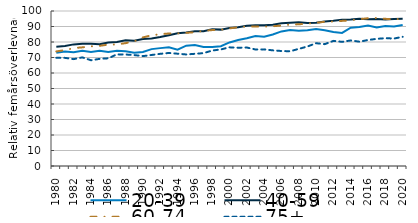
| Category | 20-39 | 40-59 | 60-74 | 75+ |
|---|---|---|---|---|
| 1980 | 73.013 | 76.924 | 73.924 | 69.779 |
| 1981 | 73.892 | 77.371 | 74.763 | 69.762 |
| 1982 | 73.431 | 78.462 | 76.093 | 68.935 |
| 1983 | 74.323 | 78.809 | 76.551 | 70.075 |
| 1984 | 73.562 | 78.889 | 77.2 | 68.221 |
| 1985 | 74.392 | 78.594 | 77.53 | 69.117 |
| 1986 | 73.508 | 79.645 | 78.325 | 69.493 |
| 1987 | 74.317 | 79.963 | 78.447 | 72.025 |
| 1988 | 74.023 | 81.139 | 79.262 | 71.94 |
| 1989 | 73.131 | 80.851 | 80.45 | 71.563 |
| 1990 | 73.559 | 81.879 | 82.974 | 70.897 |
| 1991 | 75.412 | 82.313 | 84.287 | 71.624 |
| 1992 | 76.051 | 83.256 | 85.034 | 72.378 |
| 1993 | 76.536 | 84.369 | 85.485 | 72.918 |
| 1994 | 75.095 | 85.594 | 85.551 | 72.454 |
| 1995 | 77.635 | 86.175 | 85.914 | 71.961 |
| 1996 | 77.999 | 86.902 | 86.321 | 72.385 |
| 1997 | 76.827 | 86.949 | 87.195 | 72.814 |
| 1998 | 76.732 | 88.172 | 87.692 | 74.486 |
| 1999 | 77.319 | 87.985 | 87.912 | 75.203 |
| 2000 | 79.708 | 89.055 | 88.797 | 76.552 |
| 2001 | 81.257 | 89.47 | 89.476 | 76.301 |
| 2002 | 82.369 | 90.543 | 90.091 | 76.437 |
| 2003 | 83.831 | 90.791 | 89.988 | 75.166 |
| 2004 | 83.371 | 90.792 | 89.982 | 75.243 |
| 2005 | 84.85 | 91.141 | 90.158 | 74.605 |
| 2006 | 86.837 | 92.033 | 90.63 | 74.19 |
| 2007 | 87.681 | 92.48 | 91.219 | 74.033 |
| 2008 | 87.204 | 92.765 | 91.427 | 75.561 |
| 2009 | 87.587 | 92.266 | 91.88 | 77.091 |
| 2010 | 88.374 | 92.449 | 92.34 | 79.221 |
| 2011 | 87.628 | 93.149 | 93.075 | 78.616 |
| 2012 | 86.443 | 93.673 | 93.231 | 80.722 |
| 2013 | 85.886 | 94.429 | 93.623 | 80.113 |
| 2014 | 89.224 | 94.487 | 93.946 | 80.999 |
| 2015 | 89.699 | 94.964 | 94.759 | 80.207 |
| 2016 | 90.571 | 94.725 | 95.334 | 81.276 |
| 2017 | 89.308 | 94.818 | 95.482 | 82.043 |
| 2018 | 90.384 | 94.498 | 94.957 | 82.462 |
| 2019 | 90.023 | 94.883 | 94.576 | 82.237 |
| 2020 | 90.97 | 95.038 | 95.068 | 83.339 |